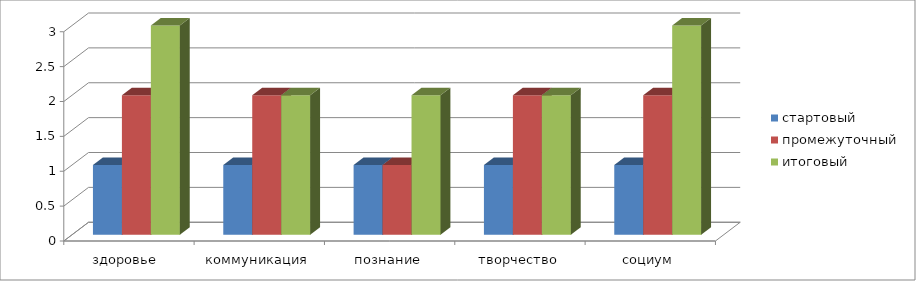
| Category | стартовый | промежуточный | итоговый |
|---|---|---|---|
| здоровье  | 1 | 2 | 3 |
| коммуникация | 1 | 2 | 2 |
| познание | 1 | 1 | 2 |
| творчество | 1 | 2 | 2 |
| социум | 1 | 2 | 3 |